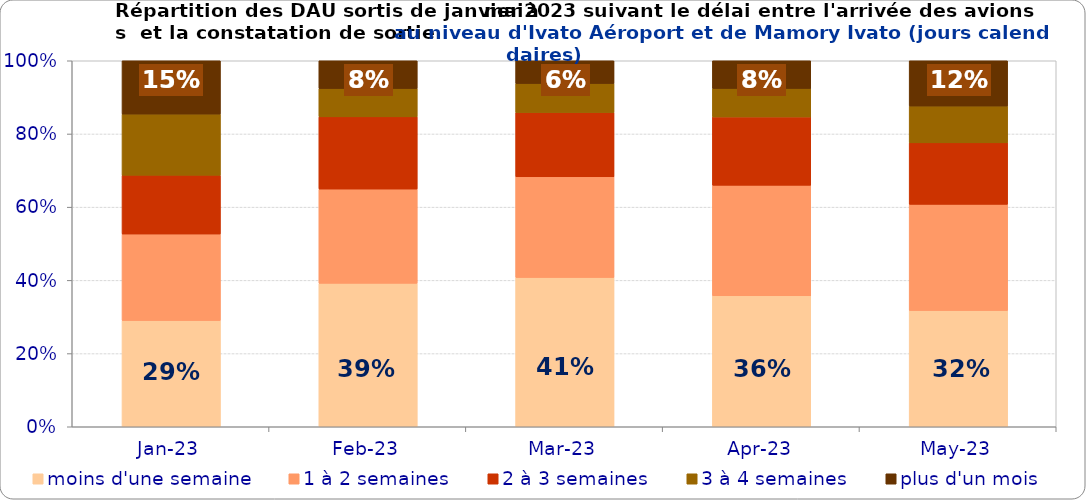
| Category | moins d'une semaine | 1 à 2 semaines | 2 à 3 semaines | 3 à 4 semaines | plus d'un mois |
|---|---|---|---|---|---|
| 2023-01-01 | 0.29 | 0.236 | 0.161 | 0.167 | 0.146 |
| 2023-02-01 | 0.392 | 0.258 | 0.197 | 0.077 | 0.076 |
| 2023-03-01 | 0.408 | 0.275 | 0.176 | 0.079 | 0.062 |
| 2023-04-01 | 0.358 | 0.302 | 0.187 | 0.078 | 0.076 |
| 2023-05-01 | 0.317 | 0.29 | 0.168 | 0.101 | 0.124 |